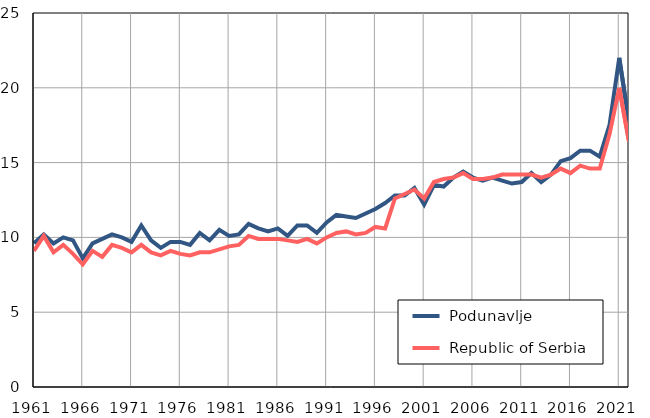
| Category |  Podunavlje |  Republic of Serbia |
|---|---|---|
| 1961.0 | 9.6 | 9.1 |
| 1962.0 | 10.2 | 10.1 |
| 1963.0 | 9.6 | 9 |
| 1964.0 | 10 | 9.5 |
| 1965.0 | 9.8 | 8.9 |
| 1966.0 | 8.6 | 8.2 |
| 1967.0 | 9.6 | 9.1 |
| 1968.0 | 9.9 | 8.7 |
| 1969.0 | 10.2 | 9.5 |
| 1970.0 | 10 | 9.3 |
| 1971.0 | 9.7 | 9 |
| 1972.0 | 10.8 | 9.5 |
| 1973.0 | 9.8 | 9 |
| 1974.0 | 9.3 | 8.8 |
| 1975.0 | 9.7 | 9.1 |
| 1976.0 | 9.7 | 8.9 |
| 1977.0 | 9.5 | 8.8 |
| 1978.0 | 10.3 | 9 |
| 1979.0 | 9.8 | 9 |
| 1980.0 | 10.5 | 9.2 |
| 1981.0 | 10.1 | 9.4 |
| 1982.0 | 10.2 | 9.5 |
| 1983.0 | 10.9 | 10.1 |
| 1984.0 | 10.6 | 9.9 |
| 1985.0 | 10.4 | 9.9 |
| 1986.0 | 10.6 | 9.9 |
| 1987.0 | 10.1 | 9.8 |
| 1988.0 | 10.8 | 9.7 |
| 1989.0 | 10.8 | 9.9 |
| 1990.0 | 10.3 | 9.6 |
| 1991.0 | 11 | 10 |
| 1992.0 | 11.5 | 10.3 |
| 1993.0 | 11.4 | 10.4 |
| 1994.0 | 11.3 | 10.2 |
| 1995.0 | 11.6 | 10.3 |
| 1996.0 | 11.9 | 10.7 |
| 1997.0 | 12.3 | 10.6 |
| 1998.0 | 12.8 | 12.6 |
| 1999.0 | 12.8 | 12.9 |
| 2000.0 | 13.3 | 13.2 |
| 2001.0 | 12.2 | 12.6 |
| 2002.0 | 13.5 | 13.7 |
| 2003.0 | 13.4 | 13.9 |
| 2004.0 | 14 | 14 |
| 2005.0 | 14.4 | 14.3 |
| 2006.0 | 14 | 13.9 |
| 2007.0 | 13.8 | 13.9 |
| 2008.0 | 14 | 14 |
| 2009.0 | 13.8 | 14.2 |
| 2010.0 | 13.6 | 14.2 |
| 2011.0 | 13.7 | 14.2 |
| 2012.0 | 14.3 | 14.2 |
| 2013.0 | 13.7 | 14 |
| 2014.0 | 14.2 | 14.2 |
| 2015.0 | 15.1 | 14.6 |
| 2016.0 | 15.3 | 14.3 |
| 2017.0 | 15.8 | 14.8 |
| 2018.0 | 15.8 | 14.6 |
| 2019.0 | 15.4 | 14.6 |
| 2020.0 | 17.5 | 16.9 |
| 2021.0 | 22 | 20 |
| 2022.0 | 17.7 | 16.4 |